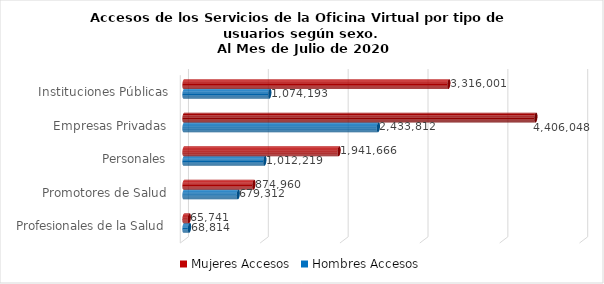
| Category | Mujeres | Hombres |
|---|---|---|
| Instituciones Públicas | 3316001 | 1074193 |
| Empresas Privadas | 4406048 | 2433812 |
| Personales | 1941666 | 1012219 |
| Promotores de Salud | 874960 | 679312 |
| Profesionales de la Salud | 65741 | 68814 |